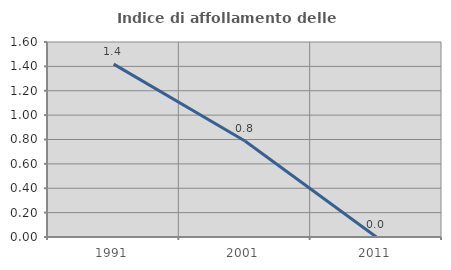
| Category | Indice di affollamento delle abitazioni  |
|---|---|
| 1991.0 | 1.418 |
| 2001.0 | 0.787 |
| 2011.0 | 0 |